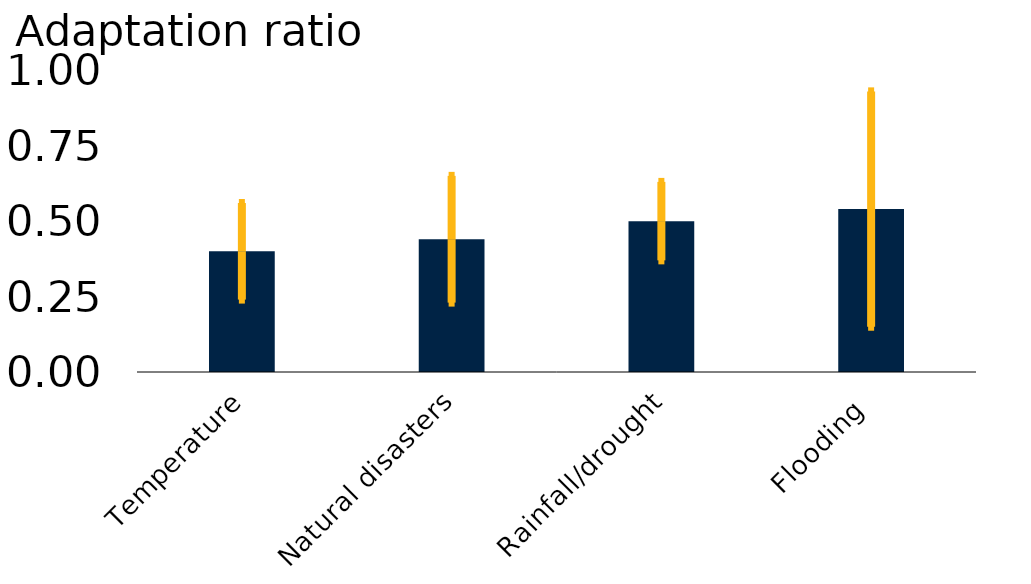
| Category | Series 0 |
|---|---|
| Temperature | 0.4 |
| Natural disasters | 0.44 |
| Rainfall/drought | 0.5 |
| Flooding | 0.54 |